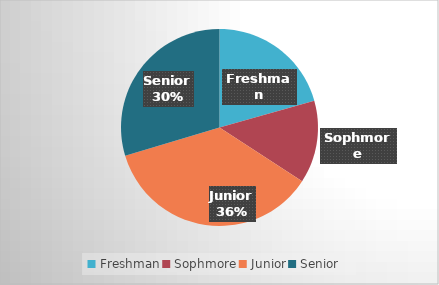
| Category | Series 0 |
|---|---|
| Freshman | 41 |
| Sophmore | 27 |
| Junior | 72 |
| Senior | 59 |